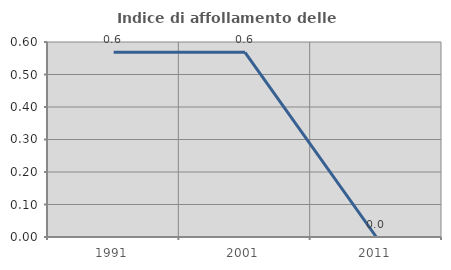
| Category | Indice di affollamento delle abitazioni  |
|---|---|
| 1991.0 | 0.568 |
| 2001.0 | 0.568 |
| 2011.0 | 0 |